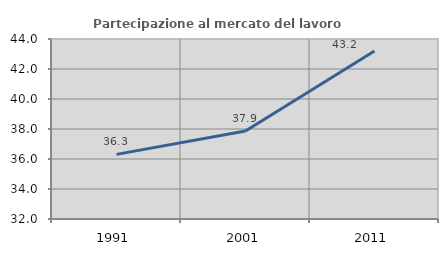
| Category | Partecipazione al mercato del lavoro  femminile |
|---|---|
| 1991.0 | 36.308 |
| 2001.0 | 37.861 |
| 2011.0 | 43.195 |